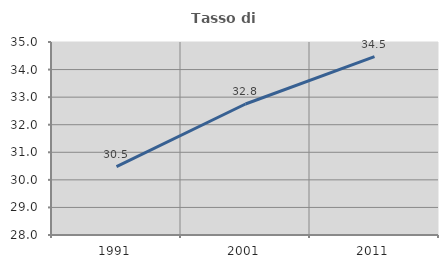
| Category | Tasso di occupazione   |
|---|---|
| 1991.0 | 30.482 |
| 2001.0 | 32.751 |
| 2011.0 | 34.472 |